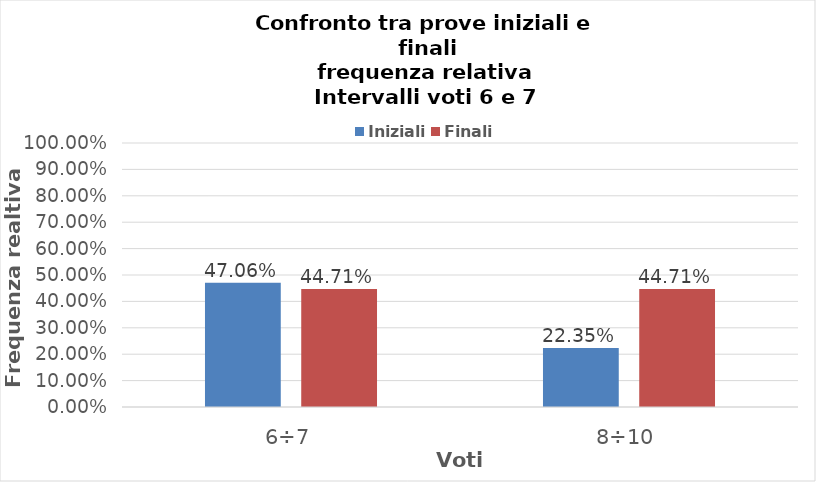
| Category | Iniziali | Finali |
|---|---|---|
| 6÷7 | 0.471 | 0.447 |
| 8÷10 | 0.224 | 0.447 |